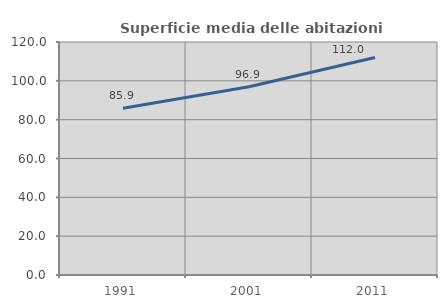
| Category | Superficie media delle abitazioni occupate |
|---|---|
| 1991.0 | 85.868 |
| 2001.0 | 96.927 |
| 2011.0 | 112.017 |